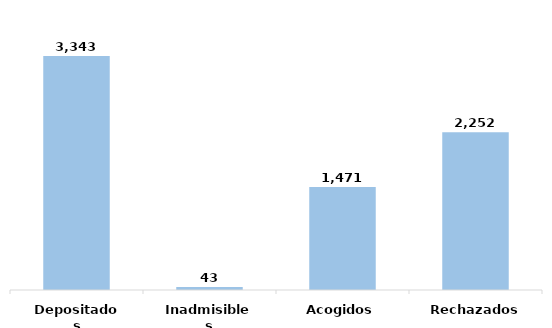
| Category | Series 0 |
|---|---|
| Depositados | 3343 |
| Inadmisibles | 43 |
| Acogidos | 1471 |
| Rechazados | 2252 |